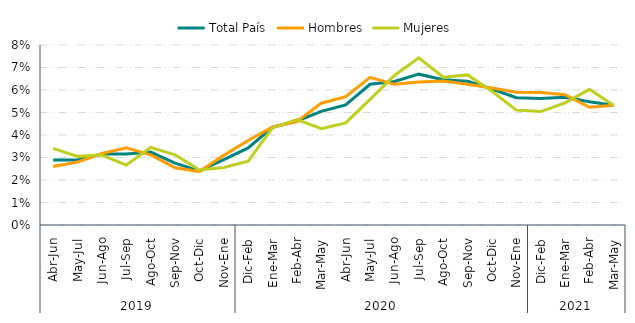
| Category | Total País | Hombres | Mujeres |
|---|---|---|---|
| 0 | 0.029 | 0.026 | 0.034 |
| 1 | 0.029 | 0.028 | 0.031 |
| 2 | 0.032 | 0.032 | 0.031 |
| 3 | 0.032 | 0.034 | 0.027 |
| 4 | 0.032 | 0.031 | 0.035 |
| 5 | 0.027 | 0.025 | 0.031 |
| 6 | 0.024 | 0.024 | 0.024 |
| 7 | 0.029 | 0.031 | 0.026 |
| 8 | 0.034 | 0.038 | 0.028 |
| 9 | 0.043 | 0.044 | 0.043 |
| 10 | 0.046 | 0.046 | 0.047 |
| 11 | 0.05 | 0.054 | 0.043 |
| 12 | 0.053 | 0.057 | 0.045 |
| 13 | 0.063 | 0.066 | 0.056 |
| 14 | 0.064 | 0.063 | 0.066 |
| 15 | 0.067 | 0.064 | 0.074 |
| 16 | 0.065 | 0.064 | 0.066 |
| 17 | 0.064 | 0.063 | 0.067 |
| 18 | 0.06 | 0.061 | 0.059 |
| 19 | 0.057 | 0.059 | 0.051 |
| 20 | 0.056 | 0.059 | 0.05 |
| 21 | 0.057 | 0.058 | 0.054 |
| 22 | 0.055 | 0.052 | 0.06 |
| 23 | 0.053 | 0.053 | 0.053 |